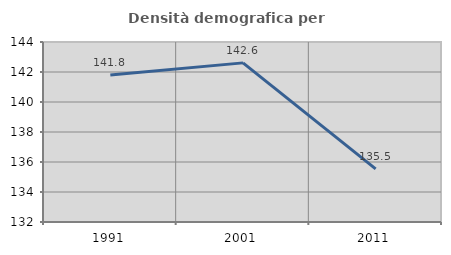
| Category | Densità demografica |
|---|---|
| 1991.0 | 141.8 |
| 2001.0 | 142.608 |
| 2011.0 | 135.545 |